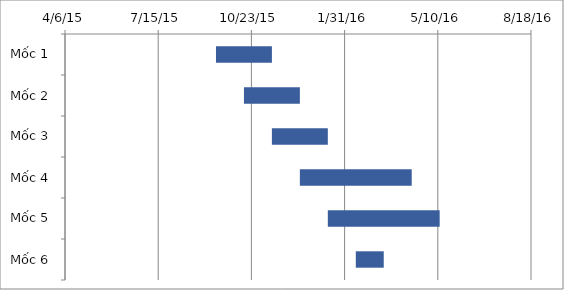
| Category | Start Date | Duration |
|---|---|---|
| Mốc 1 | 9/15/15 | 60 |
| Mốc 2 | 10/15/15 | 60 |
| Mốc 3 | 11/14/15 | 60 |
| Mốc 4 | 12/14/15 | 120 |
| Mốc 5 | 1/13/16 | 120 |
| Mốc 6 | 2/12/16 | 30 |